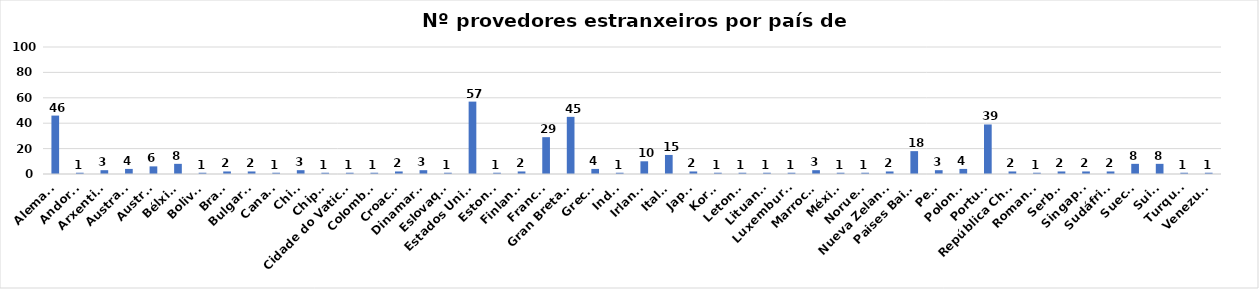
| Category | Series 0 |
|---|---|
| Alemaña | 46 |
| Andorra | 1 |
| Arxentina | 3 |
| Australia | 4 |
| Austria | 6 |
| Bélxica | 8 |
| Bolivia | 1 |
| Brasil | 2 |
| Bulgaria | 2 |
| Canadá | 1 |
| China | 3 |
| Chipre | 1 |
| Cidade do Vaticano | 1 |
| Colombia | 1 |
| Croacia | 2 |
| Dinamarca | 3 |
| Eslovaquia | 1 |
| Estados Unidos | 57 |
| Estonia | 1 |
| Finlandia | 2 |
| Francia | 29 |
| Gran Bretaña | 45 |
| Grecia | 4 |
| India | 1 |
| Irlanda | 10 |
| Italia | 15 |
| Japón | 2 |
| Korea | 1 |
| Letonia | 1 |
| Lituania | 1 |
| Luxemburgo | 1 |
| Marrocos | 3 |
| México | 1 |
| Noruega | 1 |
| Nueva Zelanda | 2 |
| Paises Baixos | 18 |
| Perú | 3 |
| Polonia | 4 |
| Portugal | 39 |
| República Checa | 2 |
| Romanía | 1 |
| Serbia | 2 |
| Singapur | 2 |
| Sudáfrica | 2 |
| Suecia | 8 |
| Suiza | 8 |
| Turquía | 1 |
| Venezuela | 1 |